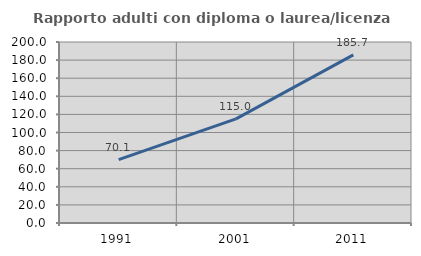
| Category | Rapporto adulti con diploma o laurea/licenza media  |
|---|---|
| 1991.0 | 70.082 |
| 2001.0 | 114.987 |
| 2011.0 | 185.734 |